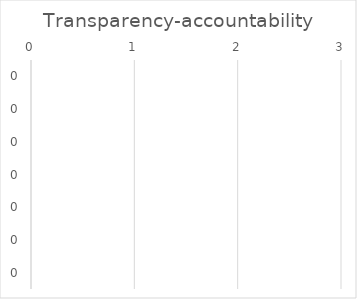
| Category | Transparency-accountability |
|---|---|
| 0.0 | 0 |
| 0.0 | 0 |
| 0.0 | 0 |
| 0.0 | 0 |
| 0.0 | 0 |
| 0.0 | 0 |
| 0.0 | 0 |